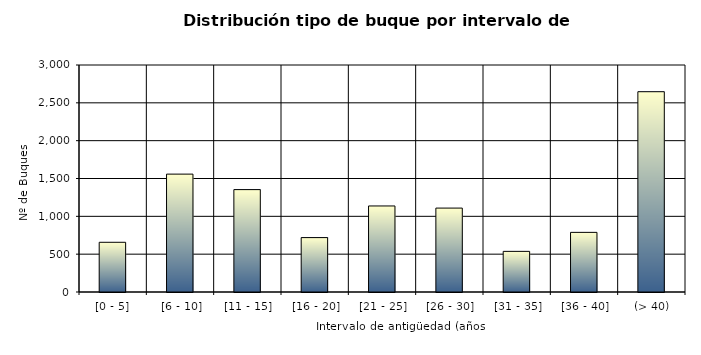
| Category | Series 0 |
|---|---|
| [0 - 5] | 657 |
|  [6 - 10] | 1558 |
|  [11 - 15] | 1353 |
|  [16 - 20] | 719 |
|  [21 - 25] | 1137 |
|  [26 - 30] | 1109 |
|  [31 - 35] | 537 |
|  [36 - 40] | 788 |
|  (> 40) | 2647 |